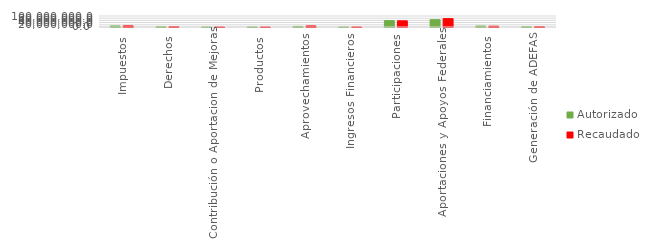
| Category | Autorizado | Recaudado |
|---|---|---|
| Impuestos | 9314383 | 10172357.9 |
| Derechos | 2568365 | 2968164.2 |
| Contribución o Aportacion de Mejoras | 164609 | 445387.4 |
| Productos | 246094 | 286877.6 |
| Aprovechamientos | 5092125 | 9511557.8 |
| Ingresos Financieros | 250000 | 507637.2 |
| Participaciones | 58073903 | 56139619.1 |
| Aportaciones y Apoyos Federales | 66633413 | 76144293.7 |
| Financiamientos | 8562000 | 7023151.4 |
| Generación de ADEFAS | 2460661 | 2460661 |